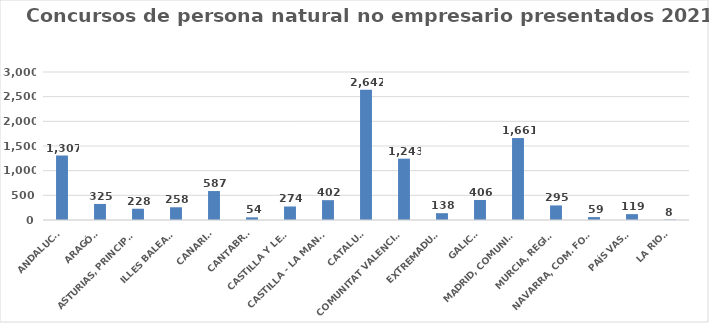
| Category | Series 0 |
|---|---|
| ANDALUCÍA | 1307 |
| ARAGÓN | 325 |
| ASTURIAS, PRINCIPADO | 228 |
| ILLES BALEARS | 258 |
| CANARIAS | 587 |
| CANTABRIA | 54 |
| CASTILLA Y LEÓN | 274 |
| CASTILLA - LA MANCHA | 402 |
| CATALUÑA | 2642 |
| COMUNITAT VALENCIANA | 1243 |
| EXTREMADURA | 138 |
| GALICIA | 406 |
| MADRID, COMUNIDAD | 1661 |
| MURCIA, REGIÓN | 295 |
| NAVARRA, COM. FORAL | 59 |
| PAÍS VASCO | 119 |
| LA RIOJA | 8 |